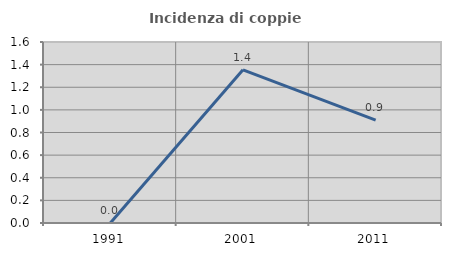
| Category | Incidenza di coppie miste |
|---|---|
| 1991.0 | 0 |
| 2001.0 | 1.354 |
| 2011.0 | 0.909 |